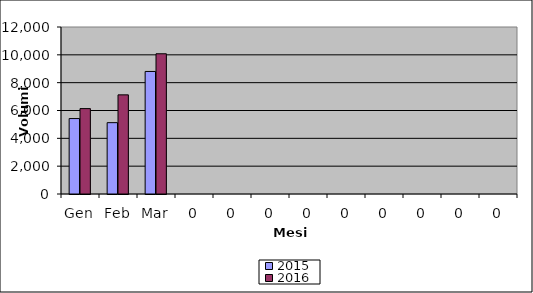
| Category | 2015 | 2016 |
|---|---|---|
| Gen | 5421 | 6136 |
| Feb | 5126 | 7123 |
| Mar | 8805 | 10076 |
| 0 | 0 | 0 |
| 0 | 0 | 0 |
| 0 | 0 | 0 |
| 0 | 0 | 0 |
| 0 | 0 | 0 |
| 0 | 0 | 0 |
| 0 | 0 | 0 |
| 0 | 0 | 0 |
| 0 | 0 | 0 |